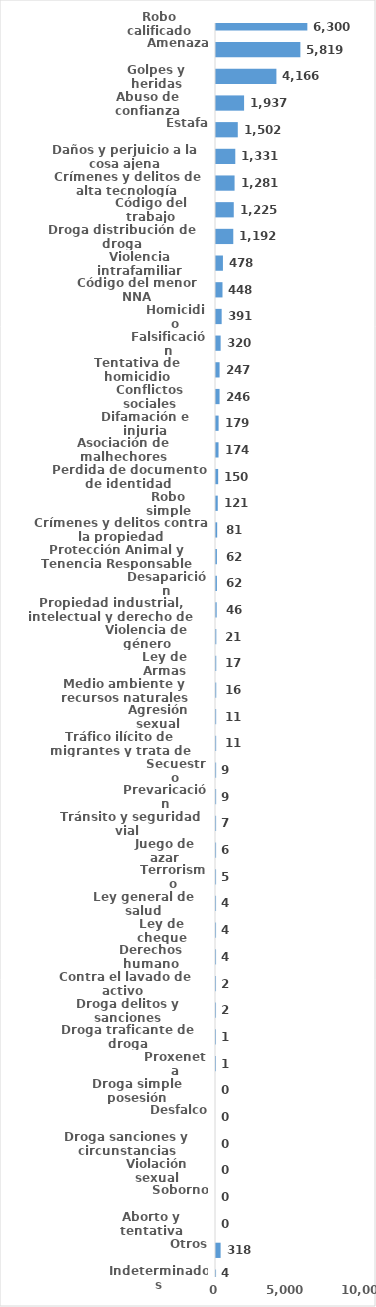
| Category | Series 0 |
|---|---|
| Robo calificado | 6300 |
| Amenaza | 5819 |
| Golpes y heridas | 4166 |
| Abuso de confianza | 1937 |
| Estafa | 1502 |
| Daños y perjuicio a la cosa ajena | 1331 |
| Crímenes y delitos de alta tecnología | 1281 |
| Código del trabajo | 1225 |
| Droga distribución de droga | 1192 |
| Violencia intrafamiliar | 478 |
| Código del menor NNA | 448 |
| Homicidio | 391 |
| Falsificación | 320 |
| Tentativa de homicidio | 247 |
| Conflictos sociales | 246 |
| Difamación e injuria | 179 |
| Asociación de malhechores | 174 |
| Perdida de documento de identidad | 150 |
| Robo simple | 121 |
| Crímenes y delitos contra la propiedad | 81 |
| Protección Animal y Tenencia Responsable | 62 |
| Desaparición | 62 |
| Propiedad industrial, intelectual y derecho de autor | 46 |
| Violencia de género | 21 |
| Ley de Armas | 17 |
| Medio ambiente y recursos naturales | 16 |
| Agresión sexual | 11 |
| Tráfico ilícito de migrantes y trata de personas | 11 |
| Secuestro | 9 |
| Prevaricación | 9 |
| Tránsito y seguridad vial  | 7 |
| Juego de azar | 6 |
| Terrorismo | 5 |
| Ley general de salud | 4 |
| Ley de cheque | 4 |
| Derechos humano | 4 |
| Contra el lavado de activo  | 2 |
| Droga delitos y sanciones | 2 |
| Droga traficante de droga | 1 |
| Proxeneta | 1 |
| Droga simple posesión | 0 |
| Desfalco | 0 |
| Droga sanciones y circunstancias agravantes | 0 |
| Violación sexual | 0 |
| Soborno | 0 |
| Aborto y tentativa | 0 |
| Otros | 318 |
| Indeterminados | 4 |